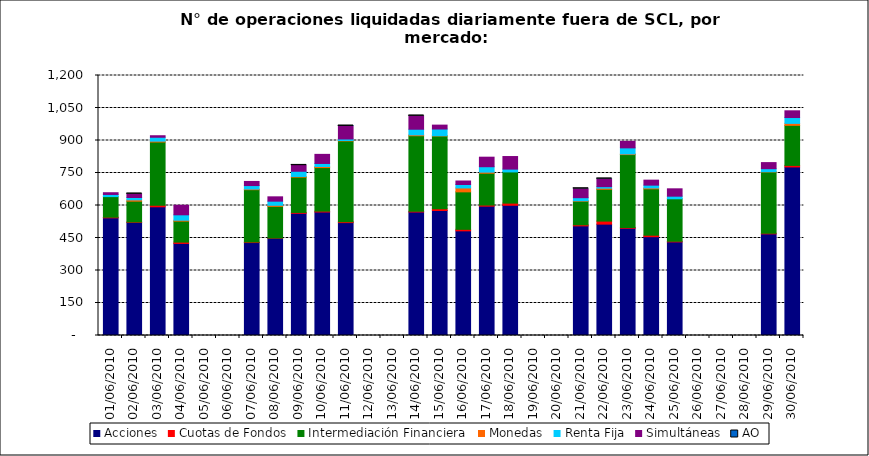
| Category | Acciones | Cuotas de Fondos | Intermediación Financiera | Monedas | Renta Fija | Simultáneas | AO |
|---|---|---|---|---|---|---|---|
| 01/06/2010 | 543 | 3 | 95 | 0 | 10 | 8 | 0 |
| 02/06/2010 | 522 | 2 | 96 | 6 | 11 | 16 | 1 |
| 03/06/2010 | 594 | 7 | 292 | 4 | 18 | 7 | 0 |
| 04/06/2010 | 425 | 6 | 97 | 4 | 25 | 44 | 0 |
| 07/06/2010 | 429 | 2 | 242 | 3 | 16 | 19 | 0 |
| 08/06/2010 | 449 | 1 | 146 | 5 | 19 | 20 | 0 |
| 09/06/2010 | 564 | 4 | 163 | 3 | 24 | 27 | 1 |
| 10/06/2010 | 570 | 4 | 201 | 5 | 14 | 42 | 0 |
| 11/06/2010 | 521 | 4 | 373 | 2 | 7 | 58 | 4 |
| 14/06/2010 | 570 | 3 | 349 | 4 | 26 | 61 | 1 |
| 15/06/2010 | 577 | 8 | 336 | 1 | 31 | 18 | 0 |
| 16/06/2010 | 483 | 7 | 173 | 18 | 16 | 16 | 0 |
| 17/06/2010 | 597 | 5 | 147 | 5 | 25 | 44 | 0 |
| 18/06/2010 | 601 | 10 | 144 | 0 | 13 | 58 | 0 |
| 21/06/2010 | 506 | 5 | 109 | 2 | 14 | 41 | 1 |
| 22/06/2010 | 514 | 14 | 147 | 5 | 7 | 35 | 2 |
| 23/06/2010 | 495 | 4 | 336 | 3 | 28 | 30 | 0 |
| 24/06/2010 | 456 | 7 | 214 | 4 | 13 | 23 | 0 |
| 25/06/2010 | 432 | 3 | 196 | 0 | 12 | 34 | 0 |
| 29/06/2010 | 469 | 3 | 283 | 1 | 14 | 28 | 0 |
| 30/06/2010 | 778 | 7 | 185 | 9 | 27 | 31 | 0 |